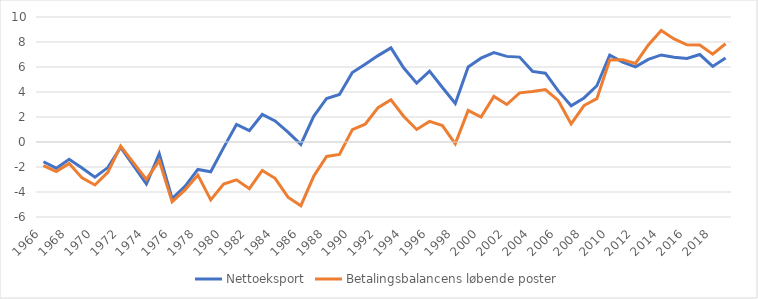
| Category | Nettoeksport | Betalingsbalancens løbende poster |
|---|---|---|
| 1966.0 | -1.578 | -1.883 |
| 1967.0 | -2.093 | -2.363 |
| 1968.0 | -1.382 | -1.713 |
| 1969.0 | -2.076 | -2.871 |
| 1970.0 | -2.81 | -3.437 |
| 1971.0 | -2.047 | -2.431 |
| 1972.0 | -0.434 | -0.33 |
| 1973.0 | -1.883 | -1.668 |
| 1974.0 | -3.362 | -2.996 |
| 1975.0 | -0.946 | -1.491 |
| 1976.0 | -4.527 | -4.79 |
| 1977.0 | -3.546 | -3.828 |
| 1978.0 | -2.193 | -2.643 |
| 1979.0 | -2.377 | -4.631 |
| 1980.0 | -0.449 | -3.359 |
| 1981.0 | 1.407 | -3.03 |
| 1982.0 | 0.914 | -3.739 |
| 1983.0 | 2.2 | -2.278 |
| 1984.0 | 1.683 | -2.907 |
| 1985.0 | 0.783 | -4.416 |
| 1986.0 | -0.196 | -5.098 |
| 1987.0 | 2.058 | -2.743 |
| 1988.0 | 3.484 | -1.16 |
| 1989.0 | 3.797 | -0.994 |
| 1990.0 | 5.552 | 0.992 |
| 1991.0 | 6.221 | 1.425 |
| 1992.0 | 6.912 | 2.746 |
| 1993.0 | 7.528 | 3.374 |
| 1994.0 | 5.92 | 2.042 |
| 1995.0 | 4.708 | 1.003 |
| 1996.0 | 5.671 | 1.647 |
| 1997.0 | 4.363 | 1.313 |
| 1998.0 | 3.078 | -0.149 |
| 1999.0 | 6.001 | 2.529 |
| 2000.0 | 6.707 | 1.989 |
| 2001.0 | 7.145 | 3.646 |
| 2002.0 | 6.85 | 3 |
| 2003.0 | 6.793 | 3.931 |
| 2004.0 | 5.651 | 4.045 |
| 2005.0 | 5.504 | 4.192 |
| 2006.0 | 4.09 | 3.325 |
| 2007.0 | 2.899 | 1.447 |
| 2008.0 | 3.525 | 2.917 |
| 2009.0 | 4.5 | 3.465 |
| 2010.0 | 6.947 | 6.563 |
| 2011.0 | 6.394 | 6.586 |
| 2012.0 | 6.016 | 6.282 |
| 2013.0 | 6.607 | 7.759 |
| 2014.0 | 6.965 | 8.924 |
| 2015.0 | 6.786 | 8.245 |
| 2016.0 | 6.685 | 7.774 |
| 2017.0 | 6.997 | 7.755 |
| 2018.0 | 6.046 | 7.029 |
| 2019.0 | 6.728 | 7.86 |